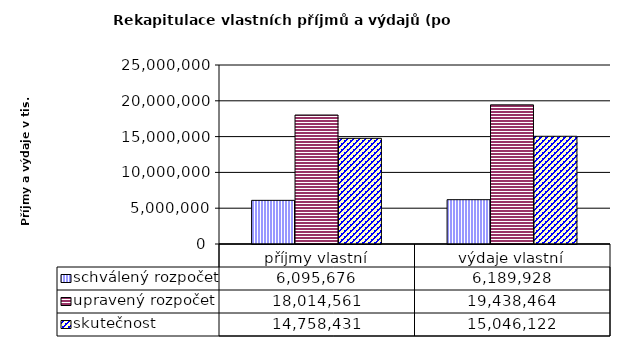
| Category | schválený rozpočet | upravený rozpočet | skutečnost |
|---|---|---|---|
| příjmy vlastní | 6095676 | 18014561 | 14758431 |
| výdaje vlastní | 6189928 | 19438464 | 15046122 |